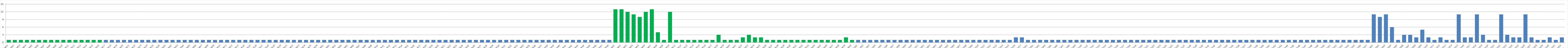
| Category | Series 0 |
|---|---|
| AW01 | 1 |
| AW02 | 1 |
| AW03 | 1 |
| AW04 | 1 |
| AW05 | 1 |
| AW06 | 1 |
| AW07 | 1 |
| AW08 | 1 |
| AW09 | 1 |
| AW10 | 1 |
| AW11 | 1 |
| AW12 | 1 |
| AW13 | 1 |
| AW14 | 1 |
| AW15 | 1 |
| AW16 | 1 |
| AW17 | 1 |
| AW18 | 1 |
| AW19 | 1 |
| AW20 | 1 |
| AW21 | 1 |
| AW22 | 1 |
| AW23 | 1 |
| AW24 | 1 |
| AW25 | 1 |
| AW26 | 1 |
| BW01 | 1 |
| BW02 | 1 |
| BW03 | 1 |
| BWO4 | 1 |
| BW05 | 1 |
| BW06 | 1 |
| BW07 | 1 |
| BW08 | 1 |
| BW09 | 1 |
| BW10 | 1 |
| BW11 | 1 |
| BW12 | 1 |
| BW13 | 1 |
| BW14 | 1 |
| BW15 | 1 |
| BW16 | 1 |
| BW17 | 1 |
| BW18 | 1 |
| BW19 | 1 |
| BW20 | 1 |
| BW21 | 1 |
| BW22 | 1 |
| BW23 | 1 |
| BW24 | 1 |
| BW25 | 1 |
| BW26 | 1 |
| CW01 | 1 |
| CW02 | 1 |
| CW03 | 1 |
| CW04 | 1 |
| CW05 | 1 |
| CW06 | 1 |
| CW07 | 1 |
| CW08 | 1 |
| CW09 | 1 |
| CW10 | 1 |
| CW11 | 1 |
| CW12 | 1 |
| CW13 | 1 |
| CW14 | 1 |
| CW15 | 1 |
| CW16 | 1 |
| CW17 | 1 |
| CW18 | 1 |
| CW19 | 1 |
| CW20 | 1 |
| CW21 | 1 |
| CW22 | 1 |
| CW23 | 1 |
| CW24 | 1 |
| CW25 | 1 |
| CW26 | 1 |
| CW27 | 1 |
| CW28 | 1 |
| CW29 | 1 |
| CW30 | 1 |
| CW31 | 1 |
| CW32 | 1 |
| CW33 | 1 |
| CW34 | 1 |
| CW35 | 1 |
| CW36 | 1 |
| CW37 | 1 |
| CW38 | 1 |
| CW39 | 1 |
| CW40 | 1 |
| CW41 | 1 |
| CW42 | 1 |
| CW43 | 1 |
| CW44 | 1 |
| CW45 | 1 |
| CW46 | 1 |
| CW47 | 1 |
| CW48 | 1 |
| DW01 | 13 |
| DW02 | 13 |
| DW03 | 12 |
| DW04 | 11 |
| DW05 | 10 |
| DW06 | 12 |
| DW07 | 13 |
| DW08 | 4 |
| DW09 | 1 |
| DW10 | 12 |
| DW11 | 1 |
| DW12 | 1 |
| DW13 | 1 |
| DW14 | 1 |
| DW15 | 1 |
| DW16 | 1 |
| DW17 | 1 |
| DW18 | 3 |
| DW19 | 1 |
| DW20 | 1 |
| DW21 | 1 |
| DW22 | 2 |
| DW23 | 3 |
| DW24 | 2 |
| DW25 | 2 |
| DW26 | 1 |
| DW27 | 1 |
| DW28 | 1 |
| DW29 | 1 |
| DW30 | 1 |
| DW31 | 1 |
| DW32 | 1 |
| DW33 | 1 |
| DW34 | 1 |
| DW35 | 1 |
| DW36 | 1 |
| DW37 | 1 |
| DW38 | 1 |
| DW39 | 2 |
| DW40 | 1 |
| AU01 | 1 |
| AU02 | 1 |
| AU03 | 1 |
| AU04 | 1 |
| AU05 | 1 |
| AU06 | 1 |
| AU07 | 1 |
| AU08 | 1 |
| AU09 | 1 |
| AU10 | 1 |
| AU11 | 1 |
| BU01 | 1 |
| BU02 | 1 |
| BU03 | 1 |
| BU04 | 1 |
| BU05 | 1 |
| BU06 | 1 |
| BU07 | 1 |
| BU08 | 1 |
| BU09 | 1 |
| BU10 | 1 |
| BU11 | 1 |
| BU12 | 1 |
| BU13 | 1 |
| BU14 | 1 |
| BU15 | 1 |
| BU16 | 2 |
| BU17 | 2 |
| CU01 | 1 |
| CU02 | 1 |
| CU03 | 1 |
| CU04 | 1 |
| CU05 | 1 |
| CU06 | 1 |
| CU07 | 1 |
| CU08 | 1 |
| CU09 | 1 |
| CU10 | 1 |
| CU11 | 1 |
| CU12 | 1 |
| CU13 | 1 |
| CU14 | 1 |
| CU15 | 1 |
| CU16 | 1 |
| CU17 | 1 |
| CU18 | 1 |
| CU19 | 1 |
| CU20 | 1 |
| CU21 | 1 |
| CU22 | 1 |
| CU23 | 1 |
| CU24 | 1 |
| CU25 | 1 |
| CU26 | 1 |
| CU27 | 1 |
| CU28 | 1 |
| CU29 | 1 |
| CU30 | 1 |
| CU31 | 1 |
| CU32 | 1 |
| CU33 | 1 |
| CU34 | 1 |
| CU35 | 1 |
| CU36 | 1 |
| CU37 | 1 |
| CU38 | 1 |
| CU39 | 1 |
| CU40 | 1 |
| CU41 | 1 |
| CU42 | 1 |
| CU43 | 1 |
| CU44 | 1 |
| CU45 | 1 |
| CU46 | 1 |
| CU47 | 1 |
| CU48 | 1 |
| CU49 | 1 |
| CU50 | 1 |
| CU51 | 1 |
| CU52 | 1 |
| CU53 | 1 |
| CU54 | 1 |
| CU55 | 1 |
| CU56 | 1 |
| CU57 | 1 |
| DU01 | 11 |
| DU02 | 10 |
| DU03 | 11 |
| DU04 | 6 |
| DU05 | 1 |
| DU06 | 3 |
| DU07 | 3 |
| DU08 | 2 |
| DU09 | 5 |
| DU10 | 2 |
| DU11 | 1 |
| DU12 | 2 |
| DU13 | 1 |
| DU14 | 1 |
| DU15 | 11 |
| DU16 | 2 |
| DU17 | 2 |
| DU18 | 11 |
| DU19 | 3 |
| DU20 | 1 |
| DU21 | 1 |
| DU22 | 11 |
| DU23 | 3 |
| DU24 | 2 |
| DU25 | 2 |
| DU26 | 11 |
| DU27 | 2 |
| DU28 | 1 |
| DU29 | 1 |
| DU30 | 2 |
| DU31 | 1 |
| DU32 | 2 |